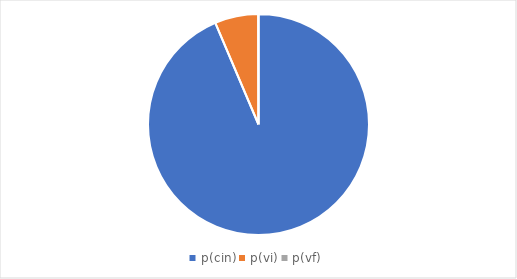
| Category | Series 0 |
|---|---|
| p(cin) | 0.936 |
| p(vi) | 0.064 |
| p(vf) | 0 |